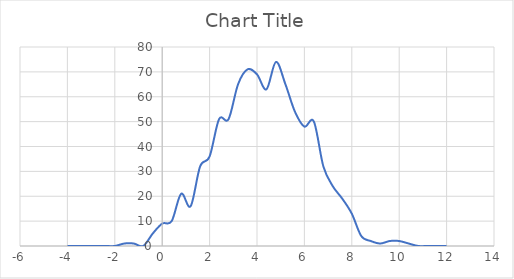
| Category | Series 0 |
|---|---|
| -4.0 | 0 |
| -3.5999999999999996 | 0 |
| -3.2 | 0 |
| -2.8 | 0 |
| -2.4000000000000004 | 0 |
| -2.0 | 0 |
| -1.5999999999999996 | 1 |
| -1.2000000000000002 | 1 |
| -0.7999999999999998 | 0 |
| -0.40000000000000036 | 5 |
| 0.0 | 9 |
| 0.3999999999999999 | 10 |
| 0.7999999999999998 | 21 |
| 1.2000000000000002 | 16 |
| 1.6 | 32 |
| 2.0 | 36 |
| 2.4 | 51 |
| 2.8 | 51 |
| 3.2 | 65 |
| 3.6 | 71 |
| 4.0 | 69 |
| 4.4 | 63 |
| 4.8 | 74 |
| 5.2 | 65 |
| 5.6 | 54 |
| 6.0 | 48 |
| 6.4 | 50 |
| 6.8 | 32 |
| 7.2 | 24 |
| 7.60000000000002 | 19 |
| 8.000000000000021 | 13 |
| 8.40000000000002 | 4 |
| 8.80000000000002 | 2 |
| 9.20000000000002 | 1 |
| 9.60000000000002 | 2 |
| 10.000000000000021 | 2 |
| 10.40000000000002 | 1 |
| 10.80000000000002 | 0 |
| 11.20000000000002 | 0 |
| 11.60000000000002 | 0 |
| 12.00000000000002 | 0 |